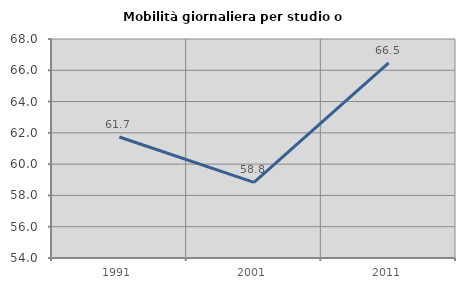
| Category | Mobilità giornaliera per studio o lavoro |
|---|---|
| 1991.0 | 61.738 |
| 2001.0 | 58.831 |
| 2011.0 | 66.477 |